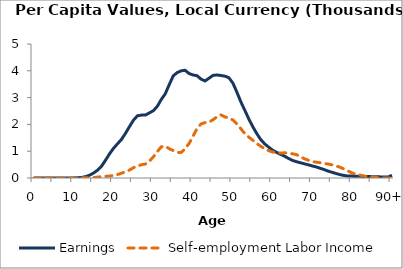
| Category | Earnings | Self-employment Labor Income |
|---|---|---|
| 0 | 0 | 0 |
|  | 0 | 0 |
| 2 | 0 | 0 |
| 3 | 0 | 0 |
| 4 | 0 | 0 |
| 5 | 0 | 0 |
| 6 | 0.058 | 0 |
| 7 | 0.18 | 0 |
| 8 | 0.681 | 0.098 |
| 9 | 2.34 | 0.538 |
| 10 | 4.655 | 1.08 |
| 11 | 8.928 | 2.464 |
| 12 | 21.746 | 4.166 |
| 13 | 51.784 | 6.033 |
| 14 | 105.183 | 9.694 |
| 15 | 188.323 | 13.845 |
| 16 | 294.908 | 33.899 |
| 17 | 444.31 | 49.972 |
| 18 | 666.688 | 65.823 |
| 19 | 903.835 | 72.1 |
| 20 | 1109.324 | 93.661 |
| 21 | 1277.784 | 130.136 |
| 22 | 1440.851 | 180.394 |
| 23 | 1665.941 | 227.92 |
| 24 | 1916.976 | 296.957 |
| 25 | 2155.46 | 385.017 |
| 26 | 2321.575 | 445.112 |
| 27 | 2346.521 | 493.52 |
| 28 | 2347.35 | 521.857 |
| 29 | 2428.08 | 627.128 |
| 30 | 2510.718 | 786.174 |
| 31 | 2674.624 | 985.501 |
| 32 | 2930.382 | 1163.38 |
| 33 | 3141.049 | 1184.09 |
| 34 | 3484.838 | 1093.927 |
| 35 | 3810.928 | 1024.329 |
| 36 | 3933.259 | 955.404 |
| 37 | 3998.686 | 954.397 |
| 38 | 4018.607 | 1088.794 |
| 39 | 3895.777 | 1292.569 |
| 40 | 3844.096 | 1562.357 |
| 41 | 3815.797 | 1849.624 |
| 42 | 3688.349 | 2016.343 |
| 43 | 3621.607 | 2066.959 |
| 44 | 3723.52 | 2084.431 |
| 45 | 3828.695 | 2173.437 |
| 46 | 3844.196 | 2286.253 |
| 47 | 3824.049 | 2354.141 |
| 48 | 3799.683 | 2278.431 |
| 49 | 3740.995 | 2242.96 |
| 50 | 3539.562 | 2164.162 |
| 51 | 3204.903 | 2015.953 |
| 52 | 2841.203 | 1839.468 |
| 53 | 2524.837 | 1654.842 |
| 54 | 2203.88 | 1524.097 |
| 55 | 1913.615 | 1410.117 |
| 56 | 1659.844 | 1289.254 |
| 57 | 1434.888 | 1184.458 |
| 58 | 1272.146 | 1090.217 |
| 59 | 1150.145 | 1020.169 |
| 60 | 1036.324 | 970.787 |
| 61 | 956.354 | 949.086 |
| 62 | 882.506 | 931.528 |
| 63 | 813.592 | 940.425 |
| 64 | 728.618 | 928.284 |
| 65 | 655.611 | 901.647 |
| 66 | 607.213 | 872.401 |
| 67 | 568.164 | 790.252 |
| 68 | 528.448 | 717.007 |
| 69 | 490.574 | 661.168 |
| 70 | 447.245 | 612.344 |
| 71 | 409.166 | 588.169 |
| 72 | 359.682 | 572.117 |
| 73 | 311.317 | 543.151 |
| 74 | 253.53 | 518.872 |
| 75 | 209.919 | 489.082 |
| 76 | 164.833 | 449.237 |
| 77 | 123.638 | 396.856 |
| 78 | 91.777 | 332.687 |
| 79 | 73.681 | 259.497 |
| 80 | 70.236 | 185.557 |
| 81 | 68.135 | 138.788 |
| 82 | 62.47 | 106.972 |
| 83 | 56.975 | 77.112 |
| 84 | 53.747 | 48.164 |
| 85 | 50.568 | 39.344 |
| 86 | 46.111 | 23.027 |
| 87 | 41.727 | 3.696 |
| 88 | 37.365 | 0 |
| 89 | 32.992 | 0 |
| 90+ | 104.538 | 0 |